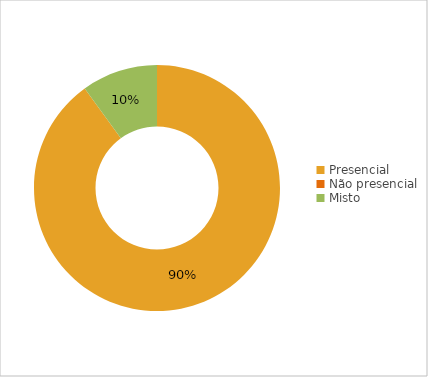
| Category | Series 0 |
|---|---|
| Presencial | 9 |
| Não presencial | 0 |
| Misto | 1 |